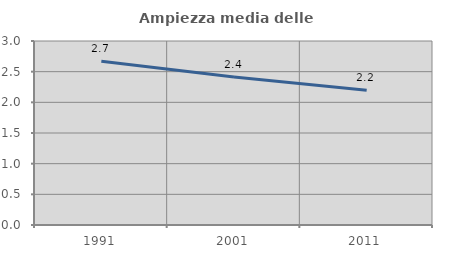
| Category | Ampiezza media delle famiglie |
|---|---|
| 1991.0 | 2.67 |
| 2001.0 | 2.413 |
| 2011.0 | 2.198 |